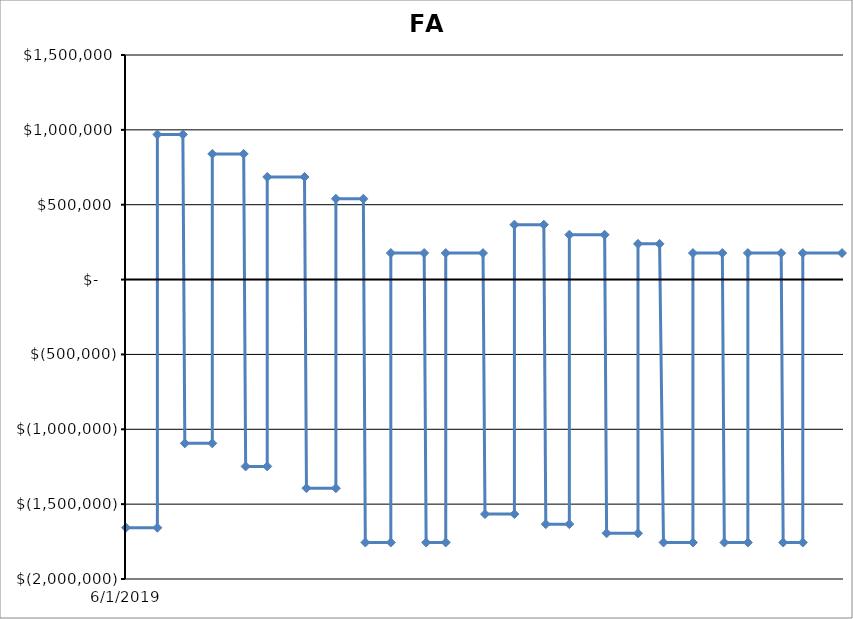
| Category | FA Requirement |
|---|---|
| 6/1/19 | -1657286.275 |
| 6/17/19 | -1657286.275 |
| 6/17/19 | 969238.725 |
| 6/30/19 | 969238.725 |
| 7/1/19 | -1093889.264 |
| 7/15/19 | -1093889.264 |
| 7/15/19 | 839360.736 |
| 7/31/19 | 839360.736 |
| 8/1/19 | -1247998.221 |
| 8/12/19 | -1247998.221 |
| 8/12/19 | 685251.779 |
| 8/31/19 | 685251.779 |
| 9/1/19 | -1393540.715 |
| 9/16/19 | -1393540.715 |
| 9/16/19 | 539709.285 |
| 9/30/19 | 539709.285 |
| 10/1/19 | -1756161.5 |
| 10/14/19 | -1756161.5 |
| 10/14/19 | 177088.5 |
| 10/31/19 | 177088.5 |
| 11/1/19 | -1756161.5 |
| 11/11/19 | -1756161.5 |
| 11/11/19 | 177088.5 |
| 11/30/19 | 177088.5 |
| 12/1/19 | -1566522.815 |
| 12/16/19 | -1566522.815 |
| 12/16/19 | 366727.185 |
| 12/31/19 | 366727.185 |
| 1/1/20 | -1633854.943 |
| 1/13/20 | -1633854.943 |
| 1/13/20 | 299395.057 |
| 1/31/20 | 299395.057 |
| 2/1/20 | -1694565.5 |
| 2/17/20 | -1694565.5 |
| 2/17/20 | 238684.5 |
| 2/28/20 | 238684.5 |
| 3/1/20 | -1756161.5 |
| 3/16/20 | -1756161.5 |
| 3/16/20 | 177088.5 |
| 3/31/20 | 177088.5 |
| 4/1/20 | -1756161.5 |
| 4/13/20 | -1756161.5 |
| 4/13/20 | 177088.5 |
| 4/30/20 | 177088.5 |
| 5/1/20 | -1756161.5 |
| 5/11/20 | -1756161.5 |
| 5/11/20 | 177088.5 |
| 5/31/20 | 177088.5 |